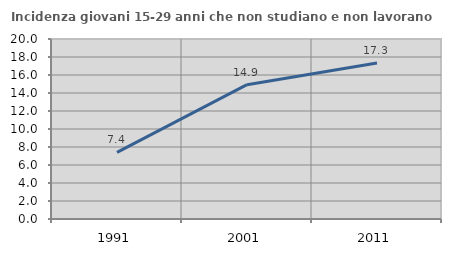
| Category | Incidenza giovani 15-29 anni che non studiano e non lavorano  |
|---|---|
| 1991.0 | 7.407 |
| 2001.0 | 14.925 |
| 2011.0 | 17.333 |